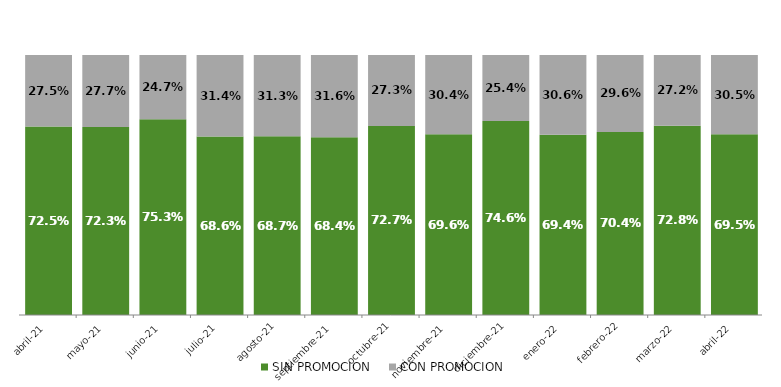
| Category | SIN PROMOCION   | CON PROMOCION   |
|---|---|---|
| 2021-04-01 | 0.725 | 0.275 |
| 2021-05-01 | 0.723 | 0.277 |
| 2021-06-01 | 0.753 | 0.247 |
| 2021-07-01 | 0.686 | 0.314 |
| 2021-08-01 | 0.687 | 0.313 |
| 2021-09-01 | 0.684 | 0.316 |
| 2021-10-01 | 0.727 | 0.273 |
| 2021-11-01 | 0.696 | 0.304 |
| 2021-12-01 | 0.746 | 0.254 |
| 2022-01-01 | 0.694 | 0.306 |
| 2022-02-01 | 0.704 | 0.296 |
| 2022-03-01 | 0.728 | 0.272 |
| 2022-04-01 | 0.695 | 0.305 |